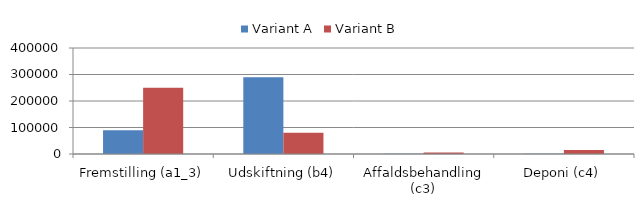
| Category | Variant A | Variant B |
|---|---|---|
| Fremstilling (a1_3) | 90000 | 250000 |
| Udskiftning (b4) | 290000 | 80000 |
| Affaldsbehandling (c3) | 947.87 | 6000 |
| Deponi (c4) | 500 | 15000 |